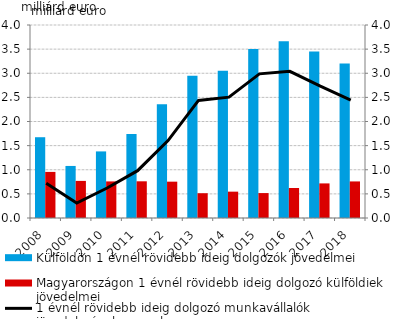
| Category | Külföldön 1 évnél rövidebb ideig dolgozók jövedelmei | Magyarországon 1 évnél rövidebb ideig dolgozó külföldiek jövedelmei |
|---|---|---|
| 2008.0 | 1.674 | 0.955 |
| 2009.0 | 1.079 | 0.769 |
| 2010.0 | 1.38 | 0.758 |
| 2011.0 | 1.741 | 0.761 |
| 2012.0 | 2.359 | 0.753 |
| 2013.0 | 2.95 | 0.514 |
| 2014.0 | 3.051 | 0.546 |
| 2015.0 | 3.504 | 0.517 |
| 2016.0 | 3.662 | 0.622 |
| 2017.0 | 3.449 | 0.717 |
| 2018.0 | 3.201 | 0.758 |